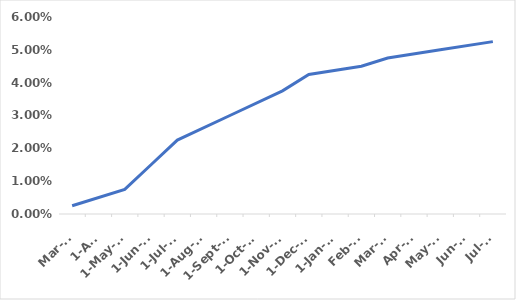
| Category | Series 0 |
|---|---|
| 2022-03-17 | 0.002 |
| 2022-05-05 | 0.008 |
| 2022-06-16 | 0.015 |
| 2022-07-27 | 0.022 |
| 2022-09-21 | 0.03 |
| 2022-11-02 | 0.038 |
| 2022-12-14 | 0.042 |
| 2023-02-01 | 0.045 |
| 2023-03-22 | 0.048 |
| 2023-05-03 | 0.05 |
| 2023-07-26 | 0.052 |